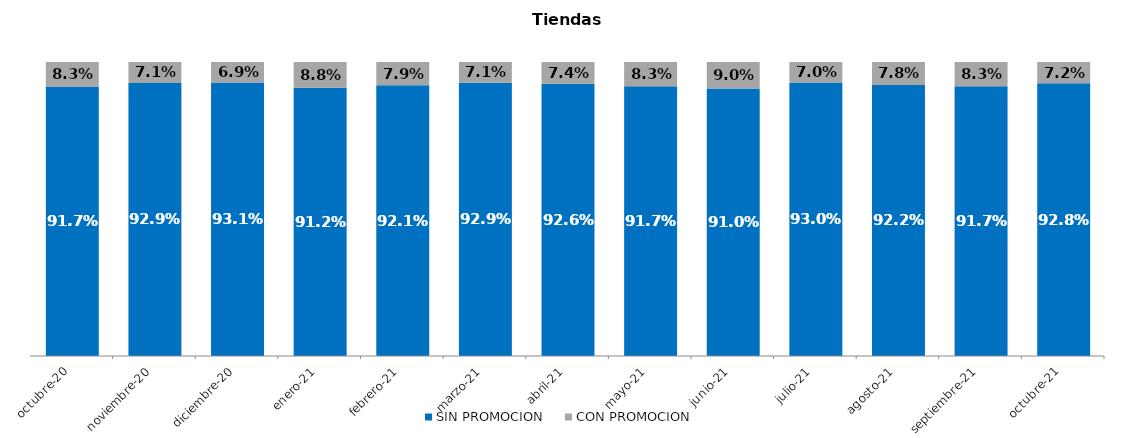
| Category | SIN PROMOCION   | CON PROMOCION   |
|---|---|---|
| 2020-10-01 | 0.917 | 0.083 |
| 2020-11-01 | 0.929 | 0.071 |
| 2020-12-01 | 0.931 | 0.069 |
| 2021-01-01 | 0.912 | 0.088 |
| 2021-02-01 | 0.921 | 0.079 |
| 2021-03-01 | 0.929 | 0.071 |
| 2021-04-01 | 0.926 | 0.074 |
| 2021-05-01 | 0.917 | 0.083 |
| 2021-06-01 | 0.91 | 0.09 |
| 2021-07-01 | 0.93 | 0.07 |
| 2021-08-01 | 0.922 | 0.078 |
| 2021-09-01 | 0.917 | 0.083 |
| 2021-10-01 | 0.928 | 0.072 |